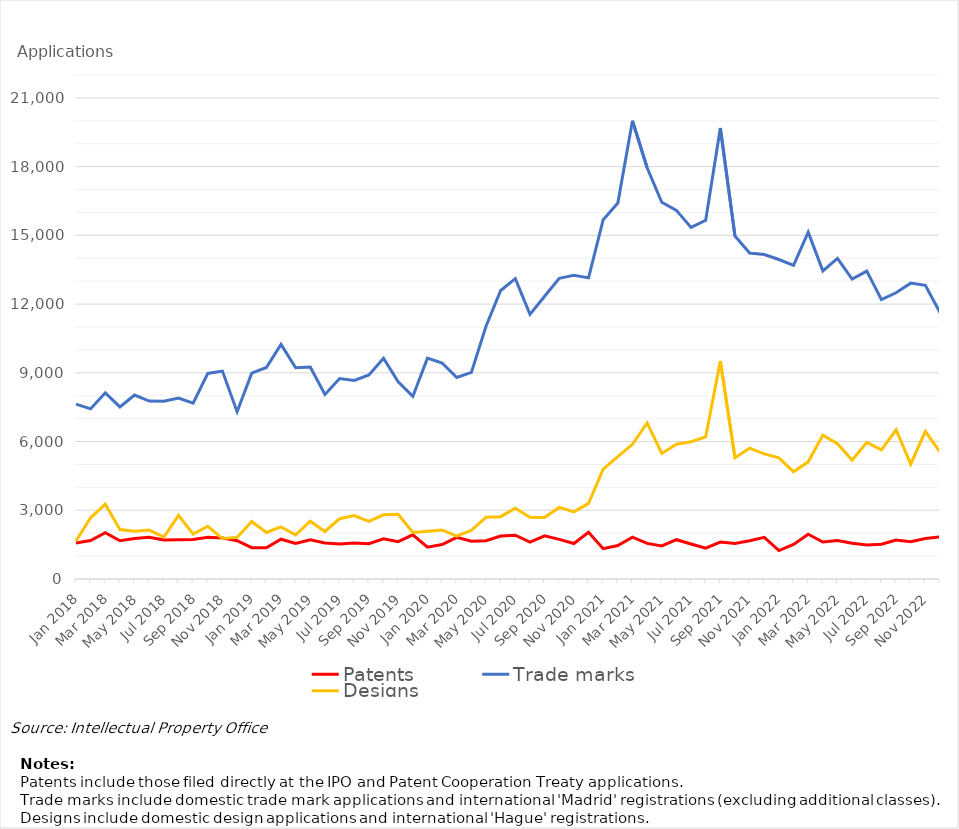
| Category | Patents | Trade marks | Designs |
|---|---|---|---|
| Jan 2018 | 1575 | 7634 | 1658 |
| Feb 2018 | 1676 | 7428 | 2672 |
| Mar 2018 | 2022 | 8127 | 3267 |
| Apr 2018 | 1670 | 7512 | 2160 |
| May 2018 | 1767 | 8030 | 2083 |
| Jun 2018 | 1821 | 7769 | 2136 |
| Jul 2018 | 1704 | 7757 | 1832 |
| Aug 2018 | 1713 | 7897 | 2777 |
| Sep 2018 | 1725 | 7673 | 1960 |
| Oct 2018 | 1818 | 8972 | 2302 |
| Nov 2018 | 1787 | 9076 | 1765 |
| Dec 2018 | 1670 | 7304 | 1815 |
| Jan 2019 | 1367 | 8985 | 2505 |
| Feb 2019 | 1361 | 9234 | 2031 |
| Mar 2019 | 1737 | 10243 | 2274 |
| Apr 2019 | 1552 | 9219 | 1923 |
| May 2019 | 1710 | 9251 | 2520 |
| Jun 2019 | 1569 | 8053 | 2074 |
| Jul 2019 | 1527 | 8752 | 2634 |
| Aug 2019 | 1571 | 8670 | 2768 |
| Sep 2019 | 1540 | 8907 | 2511 |
| Oct 2019 | 1755 | 9636 | 2800 |
| Nov 2019 | 1630 | 8607 | 2827 |
| Dec 2019 | 1926 | 7970 | 2028 |
| Jan 2020 | 1391 | 9642 | 2082 |
| Feb 2020 | 1504 | 9428 | 2143 |
| Mar 2020 | 1819 | 8794 | 1872 |
| Apr 2020 | 1648 | 9021 | 2127 |
| May 2020 | 1672 | 11035 | 2695 |
| Jun 2020 | 1879 | 12593 | 2721 |
| Jul 2020 | 1912 | 13110 | 3086 |
| Aug 2020 | 1614 | 11551 | 2695 |
| Sep 2020 | 1885 | 12340 | 2686 |
| Oct 2020 | 1730 | 13126 | 3124 |
| Nov 2020 | 1547 | 13254 | 2930 |
| Dec 2020 | 2042 | 13144 | 3302 |
| Jan 2021 | 1324 | 15685 | 4792 |
| Feb 2021 | 1462 | 16412 | 5340 |
| Mar 2021 | 1828 | 20001 | 5878 |
| Apr 2021 | 1554 | 17951 | 6815 |
| May 2021 | 1446 | 16446 | 5480 |
| Jun 2021 | 1716 | 16091 | 5881 |
| Jul 2021 | 1528 | 15345 | 5989 |
| Aug 2021 | 1344 | 15659 | 6200 |
| Sep 2021 | 1615 | 19685 | 9517 |
| Oct 2021 | 1547 | 14968 | 5292 |
| Nov 2021 | 1670 | 14232 | 5712 |
| Dec 2021 | 1818 | 14162 | 5464 |
| Jan 2022 | 1240 | 13945 | 5288 |
| Feb 2022 | 1507 | 13691 | 4683 |
| Mar 2022 | 1952 | 15142 | 5114 |
| Apr 2022 | 1617 | 13450 | 6282 |
| May 2022 | 1681 | 13992 | 5907 |
| Jun 2022 | 1559 | 13095 | 5183 |
| Jul 2022 | 1485 | 13439 | 5963 |
| Aug 2022 | 1518 | 12197 | 5639 |
| Sep 2022 | 1702 | 12493 | 6514 |
| Oct 2022 | 1630 | 12915 | 5012 |
| Nov 2022 | 1771 | 12818 | 6446 |
| Dec 2022 | 1834 | 11626 | 5543 |